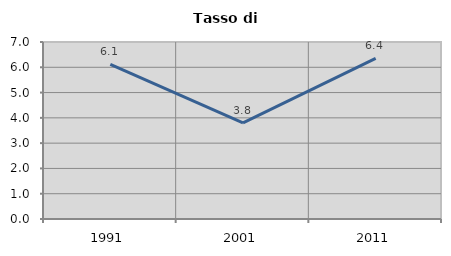
| Category | Tasso di disoccupazione   |
|---|---|
| 1991.0 | 6.119 |
| 2001.0 | 3.802 |
| 2011.0 | 6.353 |